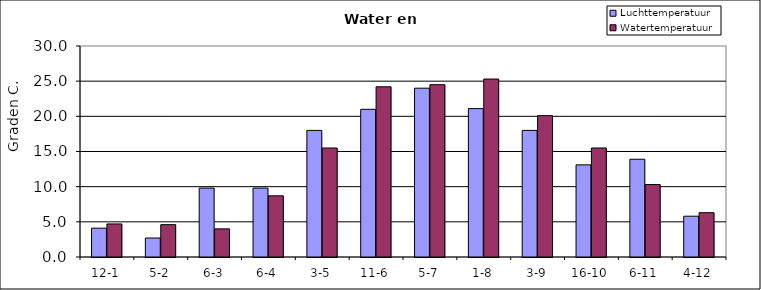
| Category | Luchttemperatuur | Watertemperatuur |
|---|---|---|
| 12-1 | 4.1 | 4.7 |
| 5-2 | 2.7 | 4.6 |
| 6-3 | 9.8 | 4 |
| 6-4 | 9.8 | 8.7 |
| 3-5 | 18 | 15.5 |
| 11-6 | 21 | 24.2 |
| 5-7 | 24 | 24.5 |
| 1-8 | 21.1 | 25.3 |
| 3-9 | 18 | 20.1 |
| 16-10 | 13.1 | 15.5 |
| 6-11 | 13.9 | 10.3 |
| 4-12 | 5.8 | 6.3 |